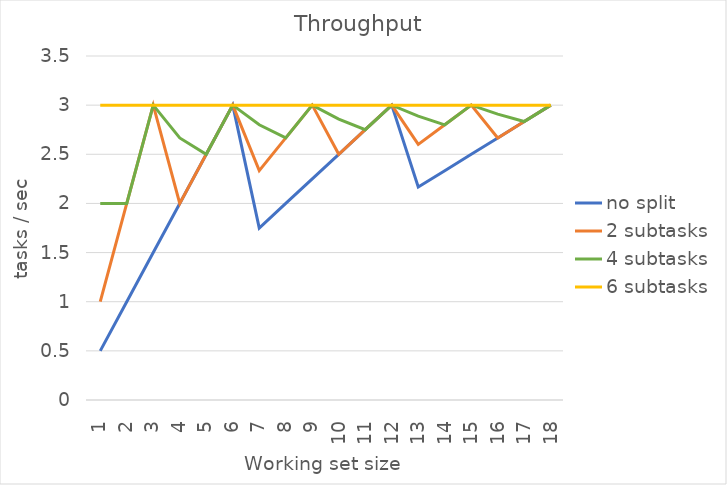
| Category | no split | 2 subtasks | 4 subtasks | 6 subtasks |
|---|---|---|---|---|
| 1.0 | 0.5 | 1 | 2 | 3 |
| 2.0 | 1 | 2 | 2 | 3 |
| 3.0 | 1.5 | 3 | 3 | 3 |
| 4.0 | 2 | 2 | 2.667 | 3 |
| 5.0 | 2.5 | 2.5 | 2.5 | 3 |
| 6.0 | 3 | 3 | 3 | 3 |
| 7.0 | 1.75 | 2.333 | 2.8 | 3 |
| 8.0 | 2 | 2.667 | 2.667 | 3 |
| 9.0 | 2.25 | 3 | 3 | 3 |
| 10.0 | 2.5 | 2.5 | 2.857 | 3 |
| 11.0 | 2.75 | 2.75 | 2.75 | 3 |
| 12.0 | 3 | 3 | 3 | 3 |
| 13.0 | 2.167 | 2.6 | 2.889 | 3 |
| 14.0 | 2.333 | 2.8 | 2.8 | 3 |
| 15.0 | 2.5 | 3 | 3 | 3 |
| 16.0 | 2.667 | 2.667 | 2.909 | 3 |
| 17.0 | 2.833 | 2.833 | 2.833 | 3 |
| 18.0 | 3 | 3 | 3 | 3 |